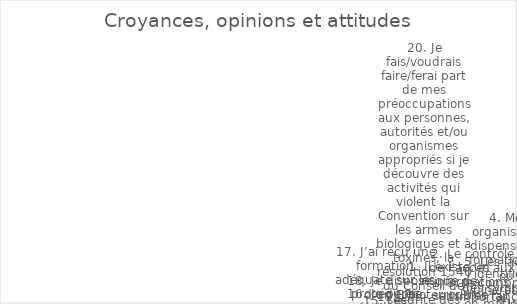
| Category | Series 0 |
|---|---|
| 1. Il existe un risque de bioterrorisme ou d’attaque avec une arme biologique. | 3 |
| 2. Le contrôle de l’accès aux informations sensibles fait partie intégrante de la biosûreté. | 1 |
| 3. Je comprends l’importance de la détermination de la fidélité. | 3 |
| 4. Mon organisation dispense une formation sur l’identification des symptômes d’un comportement à haut risque chez soi et chez les autres. | 5 |
| 5. Les lacunes ou vulnérabilités en matière de biosécurité et/ou de biosûreté sont corrigées avec un sentiment d’urgence. | 2 |
| 6. Je suis fier de mon travail. | 3 |
| 7. Mon organisation et ses membres encouragent le travail d’équipe et la coopération. | 5 |
| 8. Les infractions en matière de biosécurité et de biosûreté sont traitées de manière appropriée. | 0 |
| 9. Mon organisation se soucie plus de la biosécurité que des résultats de notre travail. | 5 |
| 10. Je suis conscient qu’il y a des problèmes et des conséquences éthiques, juridiques et sociétaux liés à mes recherches. | 4 |
| 11. L’expertise technique et l’expérience soutiennent l’assurance des performances futures en matière de biosécurité. | 0 |
| 12. Dans mon organisation, les individus ont les compétences appropriées pour effectuer les tâches qui leur sont assignées et pour travailler de manière sécuritaire et efficace. | 5 |
| 13. Mon organisation a une culture qui soutient et encourage la confiance, la collaboration, la consultation et la communication en matière de biosécurité et de biosûreté. | 2 |
| 14. La politique et la législation nationales relatives aux sciences de la vie visent à assurer une protection contre le mésusage de la science.6 | 0 |
| 15. Les évaluations des risques sont des outils importants pour identifier les domaines à améliorer et des mesures spécifiques pour réduire les risques, y compris le niveau de confinement requis. | 3 |
| 16. Je pense qu’il est important de signaler non seulement les accidents et incidents de laboratoire, mais aussi les quasi-accidents. | 4 |
| 17. J’ai reçu une formation adéquate sur les procédures nécessaires pour effectuer mon travail sans compromettre la sécurité et la sûreté. | 4 |
| 18. Je dispose d’un EPI adéquat pour effectuer mon travail en toute sécurité. | 1 |
| 19. Les scientifiques ont l’obligation de ne pas nuire . | 1 |
| 20. Je fais/voudrais faire/ferai part de mes préoccupations aux personnes, autorités et/ou organismes appropriés si je découvre des activités qui violent la Convention sur les armes biologiques et à toxines, la résolution 1540 du Conseil de sécurité des N | 1 |